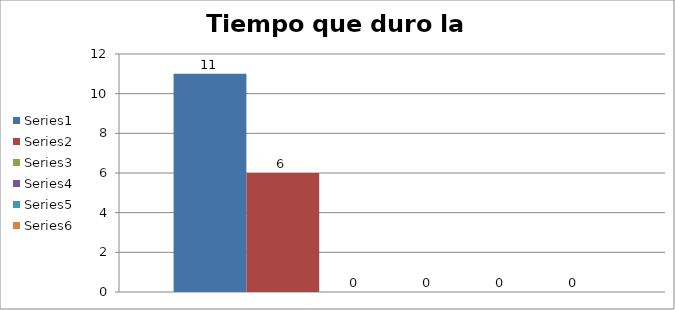
| Category | Series 0 | Series 1 | Series 2 | Series 3 | Series 4 | Series 5 |
|---|---|---|---|---|---|---|
| 0 | 11 | 6 | 0 | 0 | 0 | 0 |